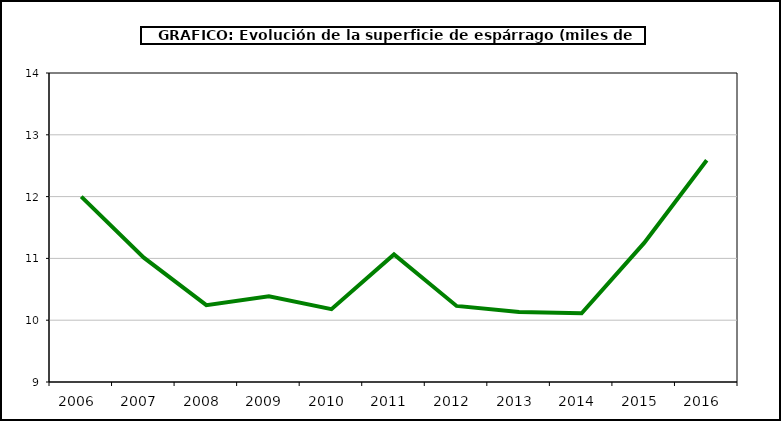
| Category | superficie |
|---|---|
| 2006.0 | 11.999 |
| 2007.0 | 11.012 |
| 2008.0 | 10.243 |
| 2009.0 | 10.387 |
| 2010.0 | 10.178 |
| 2011.0 | 11.065 |
| 2012.0 | 10.231 |
| 2013.0 | 10.132 |
| 2014.0 | 10.112 |
| 2015.0 | 11.251 |
| 2016.0 | 12.589 |